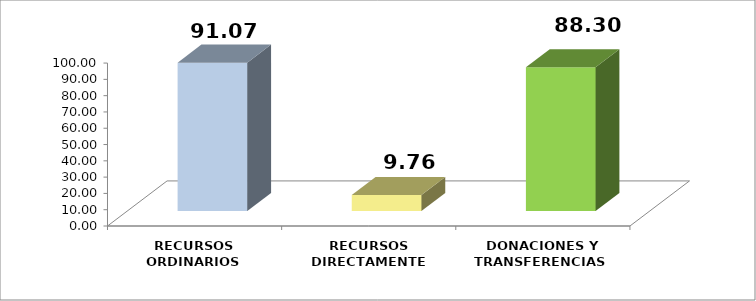
| Category | PORCENTAJE |
|---|---|
| RECURSOS ORDINARIOS | 91.067 |
| RECURSOS DIRECTAMENTE RECAUDADOS  | 9.765 |
| DONACIONES Y TRANSFERENCIAS  | 88.296 |